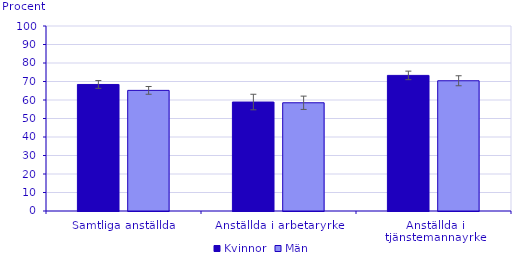
| Category | Kvinnor | Män |
|---|---|---|
| Samtliga anställda | 68.4 | 65.2 |
| Anställda i arbetaryrke | 58.9 | 58.5 |
| Anställda i tjänstemannayrke | 73.3 | 70.4 |